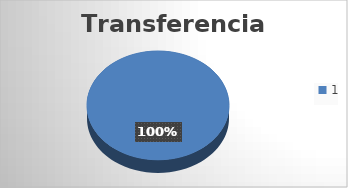
| Category | Transferencias |
|---|---|
| 0 | 13 |